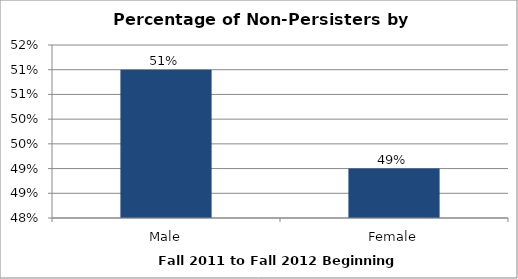
| Category | Series 0 |
|---|---|
| Male | 0.51 |
| Female | 0.49 |